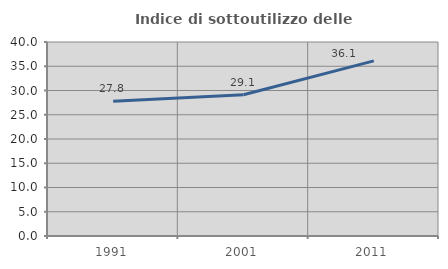
| Category | Indice di sottoutilizzo delle abitazioni  |
|---|---|
| 1991.0 | 27.805 |
| 2001.0 | 29.137 |
| 2011.0 | 36.105 |